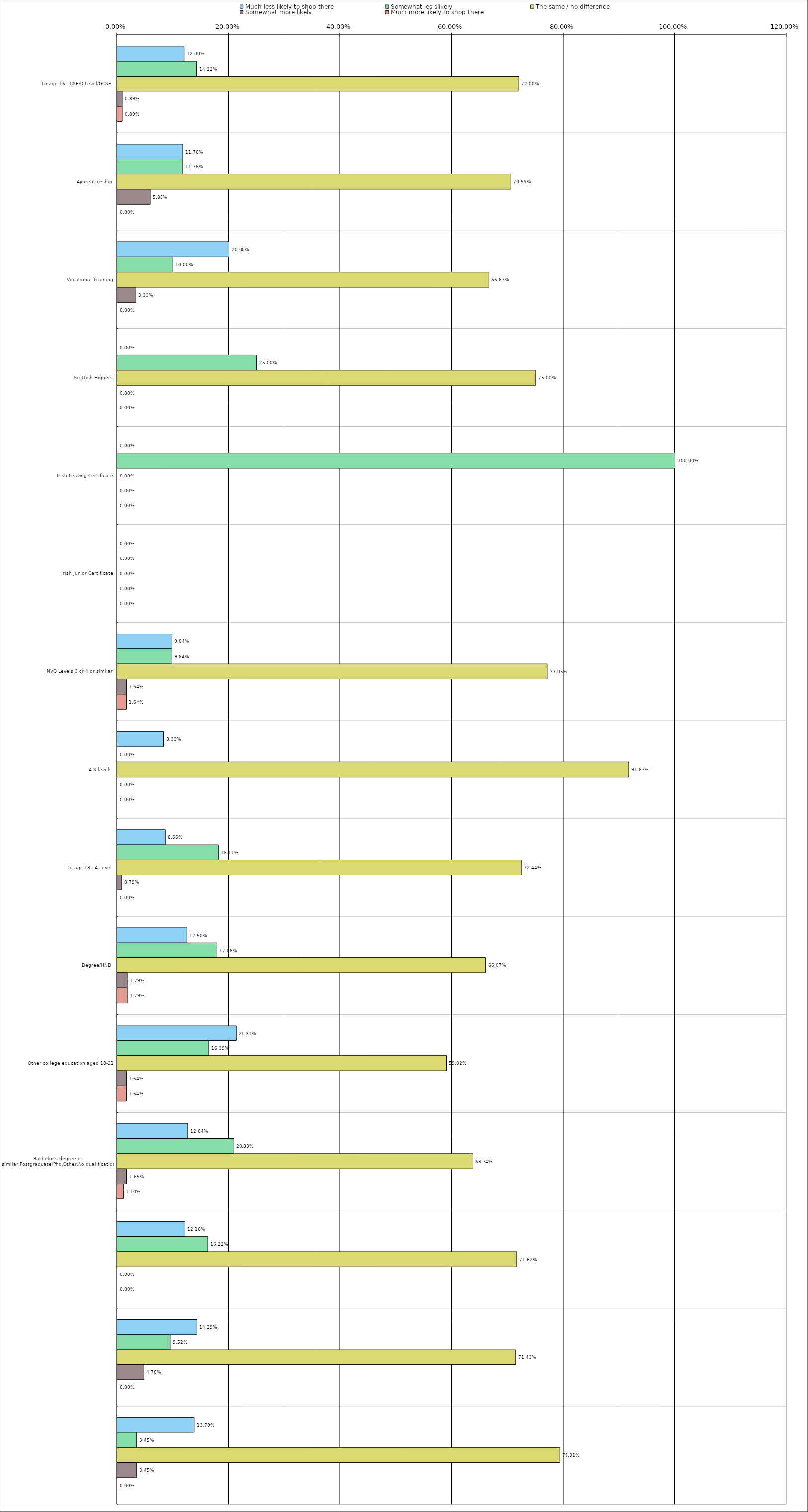
| Category | Much less likely to shop there | Somewhat les slikely | The same / no difference | Somewhat more likely | Much more likely to shop there |
|---|---|---|---|---|---|
| 0 | 0.12 | 0.142 | 0.72 | 0.009 | 0.009 |
| 1 | 0.118 | 0.118 | 0.706 | 0.059 | 0 |
| 2 | 0.2 | 0.1 | 0.667 | 0.033 | 0 |
| 3 | 0 | 0.25 | 0.75 | 0 | 0 |
| 4 | 0 | 1 | 0 | 0 | 0 |
| 5 | 0 | 0 | 0 | 0 | 0 |
| 6 | 0.098 | 0.098 | 0.77 | 0.016 | 0.016 |
| 7 | 0.083 | 0 | 0.917 | 0 | 0 |
| 8 | 0.087 | 0.181 | 0.724 | 0.008 | 0 |
| 9 | 0.125 | 0.179 | 0.661 | 0.018 | 0.018 |
| 10 | 0.213 | 0.164 | 0.59 | 0.016 | 0.016 |
| 11 | 0.126 | 0.209 | 0.637 | 0.016 | 0.011 |
| 12 | 0.122 | 0.162 | 0.716 | 0 | 0 |
| 13 | 0.143 | 0.095 | 0.714 | 0.048 | 0 |
| 14 | 0.138 | 0.034 | 0.793 | 0.034 | 0 |